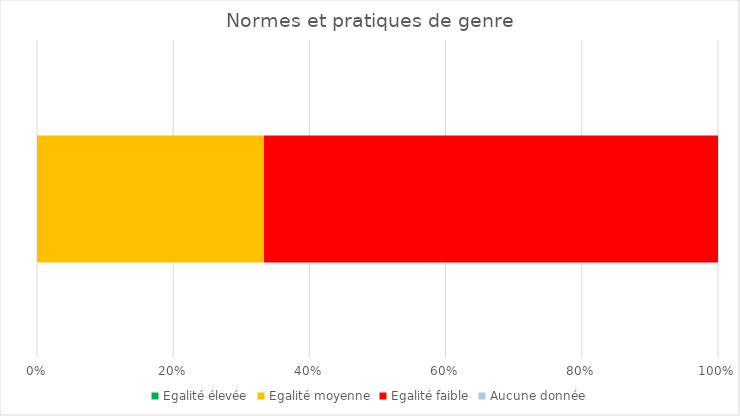
| Category | Egalité élevée | Egalité moyenne | Egalité faible | Aucune donnée |
|---|---|---|---|---|
| 0 | 0 | 1 | 2 | 0 |